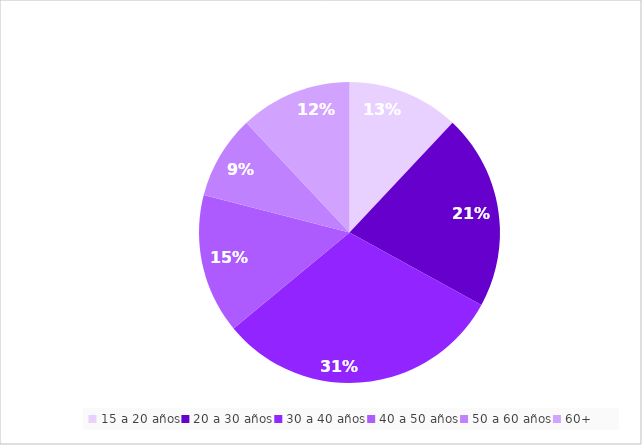
| Category | porcentaje |
|---|---|
| 15 a 20 años | 12 |
| 20 a 30 años | 21 |
| 30 a 40 años | 31 |
| 40 a 50 años | 15 |
| 50 a 60 años | 9 |
| 60+ | 12 |